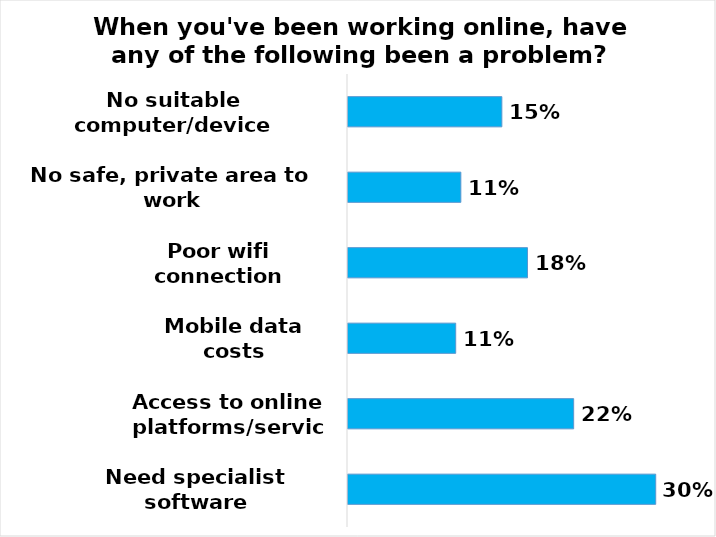
| Category | Series 0 |
|---|---|
| No suitable computer/device | 0.15 |
| No safe, private area to work | 0.11 |
| Poor wifi connection | 0.175 |
| Mobile data costs | 0.105 |
| Access to online platforms/services | 0.22 |
| Need specialist software | 0.3 |